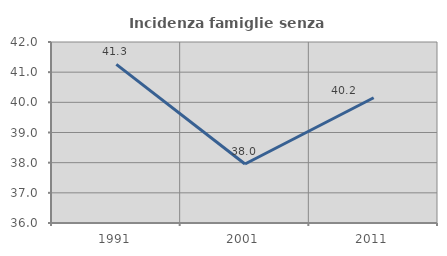
| Category | Incidenza famiglie senza nuclei |
|---|---|
| 1991.0 | 41.259 |
| 2001.0 | 37.956 |
| 2011.0 | 40.152 |